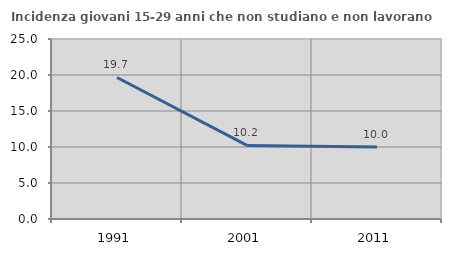
| Category | Incidenza giovani 15-29 anni che non studiano e non lavorano  |
|---|---|
| 1991.0 | 19.658 |
| 2001.0 | 10.224 |
| 2011.0 | 10.017 |